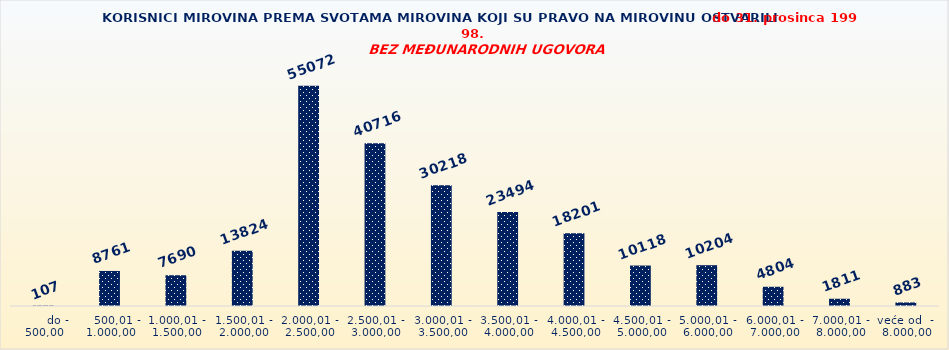
| Category | Series 0 |
|---|---|
|       do - 500,00 | 107 |
|    500,01 - 1.000,00 | 8761 |
| 1.000,01 - 1.500,00 | 7690 |
| 1.500,01 - 2.000,00 | 13824 |
| 2.000,01 - 2.500,00 | 55072 |
| 2.500,01 - 3.000,00 | 40716 |
| 3.000,01 - 3.500,00 | 30218 |
| 3.500,01 - 4.000,00 | 23494 |
| 4.000,01 - 4.500,00 | 18201 |
| 4.500,01 - 5.000,00 | 10118 |
| 5.000,01 - 6.000,00 | 10204 |
| 6.000,01 - 7.000,00 | 4804 |
| 7.000,01 - 8.000,00 | 1811 |
| veće od  -  8.000,00 | 883 |